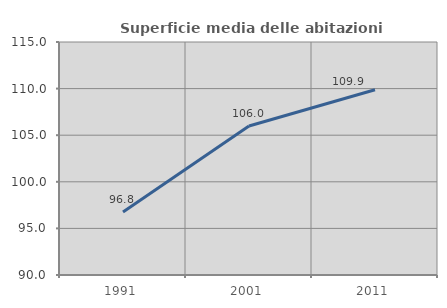
| Category | Superficie media delle abitazioni occupate |
|---|---|
| 1991.0 | 96.763 |
| 2001.0 | 105.984 |
| 2011.0 | 109.874 |